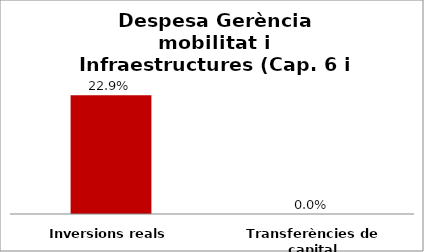
| Category | Series 0 |
|---|---|
| Inversions reals | 0.229 |
| Transferències de capital | 0 |